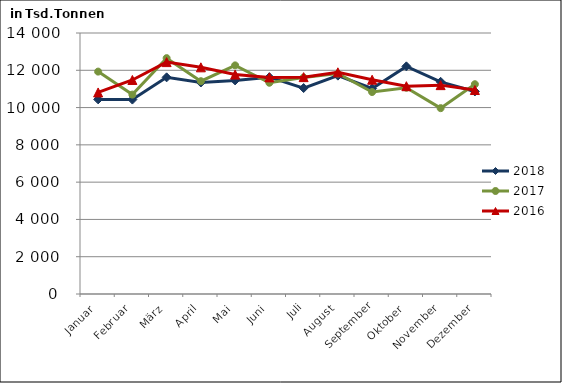
| Category | 2018 | 2017 | 2016 |
|---|---|---|---|
| Januar | 10439.5 | 11929.047 | 10811.685 |
| Februar | 10428.9 | 10695.71 | 11480.631 |
| März | 11620.8 | 12650.97 | 12438.691 |
| April | 11346.4 | 11413.511 | 12157.936 |
| Mai | 11457.8 | 12262.781 | 11770.352 |
| Juni | 11631.2 | 11331.271 | 11618.936 |
| Juli | 11046.8 | 11611.336 | 11632.772 |
| August | 11713.4 | 11824.714 | 11889.738 |
| September | 11021.8 | 10834.028 | 11492.729 |
| Oktober | 12210.1 | 11064.287 | 11146.784 |
| November | 11381.2 | 9968.597 | 11203.61 |
| Dezember | 10865.2 | 11252.284 | 10941.578 |